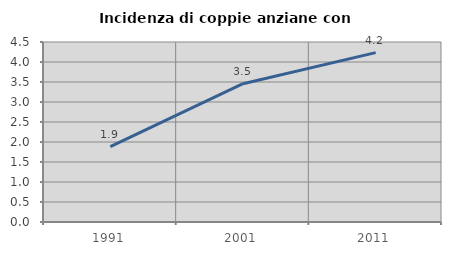
| Category | Incidenza di coppie anziane con figli |
|---|---|
| 1991.0 | 1.885 |
| 2001.0 | 3.457 |
| 2011.0 | 4.234 |